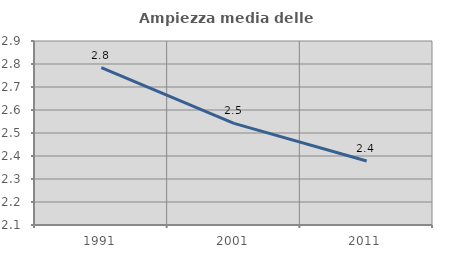
| Category | Ampiezza media delle famiglie |
|---|---|
| 1991.0 | 2.784 |
| 2001.0 | 2.542 |
| 2011.0 | 2.378 |